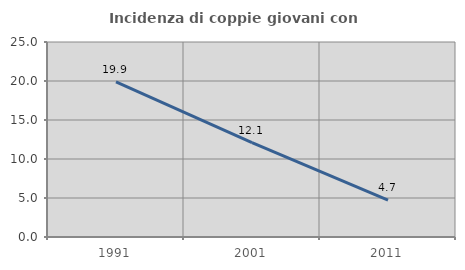
| Category | Incidenza di coppie giovani con figli |
|---|---|
| 1991.0 | 19.89 |
| 2001.0 | 12.104 |
| 2011.0 | 4.72 |